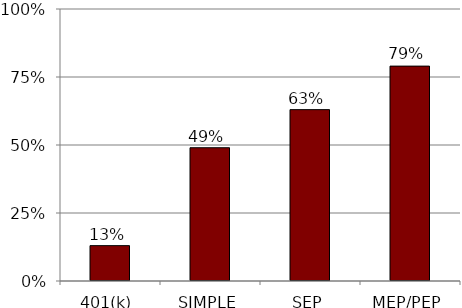
| Category | Not too familiar/never heard of |
|---|---|
| 401(k) | 0.13 |
| SIMPLE | 0.49 |
| SEP | 0.63 |
| MEP/PEP | 0.79 |